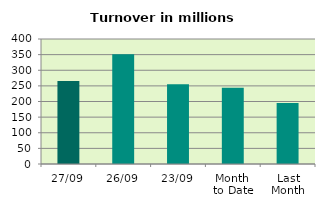
| Category | Series 0 |
|---|---|
| 27/09 | 265.509 |
| 26/09 | 351.547 |
| 23/09 | 255.417 |
| Month 
to Date | 244.217 |
| Last
Month | 195.366 |